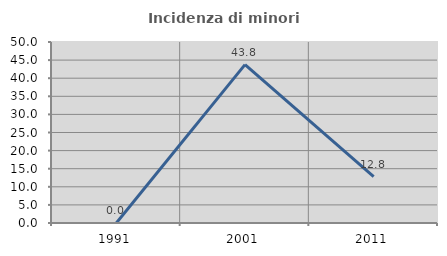
| Category | Incidenza di minori stranieri |
|---|---|
| 1991.0 | 0 |
| 2001.0 | 43.75 |
| 2011.0 | 12.821 |